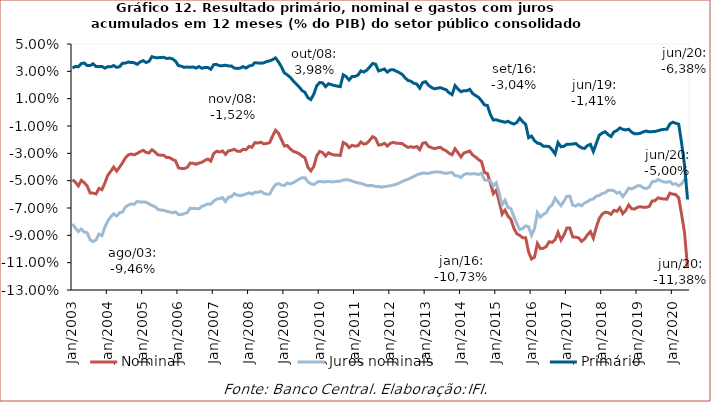
| Category | Nominal | Juros nominais | Primário |
|---|---|---|---|
| 2003-01-01 | -0.049 | -0.082 | 0.032 |
| 2003-02-01 | -0.051 | -0.085 | 0.034 |
| 2003-03-01 | -0.054 | -0.087 | 0.033 |
| 2003-04-01 | -0.05 | -0.085 | 0.036 |
| 2003-05-01 | -0.051 | -0.088 | 0.036 |
| 2003-06-01 | -0.054 | -0.088 | 0.034 |
| 2003-07-01 | -0.059 | -0.093 | 0.034 |
| 2003-08-01 | -0.059 | -0.095 | 0.036 |
| 2003-09-01 | -0.06 | -0.093 | 0.034 |
| 2003-10-01 | -0.056 | -0.089 | 0.033 |
| 2003-11-01 | -0.057 | -0.09 | 0.034 |
| 2003-12-01 | -0.052 | -0.084 | 0.032 |
| 2004-01-01 | -0.046 | -0.079 | 0.033 |
| 2004-02-01 | -0.043 | -0.076 | 0.033 |
| 2004-03-01 | -0.04 | -0.074 | 0.034 |
| 2004-04-01 | -0.043 | -0.076 | 0.033 |
| 2004-05-01 | -0.04 | -0.073 | 0.033 |
| 2004-06-01 | -0.037 | -0.073 | 0.036 |
| 2004-07-01 | -0.033 | -0.069 | 0.036 |
| 2004-08-01 | -0.031 | -0.068 | 0.037 |
| 2004-09-01 | -0.031 | -0.067 | 0.036 |
| 2004-10-01 | -0.031 | -0.067 | 0.036 |
| 2004-11-01 | -0.03 | -0.065 | 0.035 |
| 2004-12-01 | -0.029 | -0.066 | 0.037 |
| 2005-01-01 | -0.028 | -0.066 | 0.038 |
| 2005-02-01 | -0.029 | -0.066 | 0.036 |
| 2005-03-01 | -0.03 | -0.067 | 0.037 |
| 2005-04-01 | -0.027 | -0.068 | 0.041 |
| 2005-05-01 | -0.029 | -0.069 | 0.04 |
| 2005-06-01 | -0.031 | -0.071 | 0.04 |
| 2005-07-01 | -0.031 | -0.072 | 0.04 |
| 2005-08-01 | -0.031 | -0.072 | 0.04 |
| 2005-09-01 | -0.033 | -0.072 | 0.039 |
| 2005-10-01 | -0.033 | -0.073 | 0.04 |
| 2005-11-01 | -0.034 | -0.074 | 0.039 |
| 2005-12-01 | -0.035 | -0.073 | 0.037 |
| 2006-01-01 | -0.041 | -0.075 | 0.034 |
| 2006-02-01 | -0.041 | -0.075 | 0.034 |
| 2006-03-01 | -0.041 | -0.074 | 0.033 |
| 2006-04-01 | -0.04 | -0.073 | 0.033 |
| 2006-05-01 | -0.037 | -0.07 | 0.033 |
| 2006-06-01 | -0.037 | -0.07 | 0.033 |
| 2006-07-01 | -0.038 | -0.07 | 0.032 |
| 2006-08-01 | -0.037 | -0.071 | 0.034 |
| 2006-09-01 | -0.037 | -0.069 | 0.032 |
| 2006-10-01 | -0.035 | -0.068 | 0.033 |
| 2006-11-01 | -0.034 | -0.067 | 0.033 |
| 2006-12-01 | -0.036 | -0.067 | 0.032 |
| 2007-01-01 | -0.03 | -0.065 | 0.035 |
| 2007-02-01 | -0.028 | -0.063 | 0.035 |
| 2007-03-01 | -0.029 | -0.063 | 0.034 |
| 2007-04-01 | -0.028 | -0.062 | 0.034 |
| 2007-05-01 | -0.031 | -0.065 | 0.035 |
| 2007-06-01 | -0.028 | -0.062 | 0.034 |
| 2007-07-01 | -0.028 | -0.062 | 0.034 |
| 2007-08-01 | -0.027 | -0.059 | 0.032 |
| 2007-09-01 | -0.028 | -0.061 | 0.032 |
| 2007-10-01 | -0.029 | -0.061 | 0.032 |
| 2007-11-01 | -0.027 | -0.06 | 0.033 |
| 2007-12-01 | -0.027 | -0.06 | 0.032 |
| 2008-01-01 | -0.025 | -0.059 | 0.034 |
| 2008-02-01 | -0.026 | -0.06 | 0.034 |
| 2008-03-01 | -0.022 | -0.058 | 0.036 |
| 2008-04-01 | -0.022 | -0.059 | 0.036 |
| 2008-05-01 | -0.022 | -0.058 | 0.036 |
| 2008-06-01 | -0.023 | -0.059 | 0.036 |
| 2008-07-01 | -0.023 | -0.06 | 0.037 |
| 2008-08-01 | -0.022 | -0.06 | 0.038 |
| 2008-09-01 | -0.017 | -0.056 | 0.039 |
| 2008-10-01 | -0.013 | -0.053 | 0.04 |
| 2008-11-01 | -0.015 | -0.052 | 0.037 |
| 2008-12-01 | -0.02 | -0.053 | 0.033 |
| 2009-01-01 | -0.025 | -0.054 | 0.029 |
| 2009-02-01 | -0.024 | -0.052 | 0.027 |
| 2009-03-01 | -0.027 | -0.052 | 0.026 |
| 2009-04-01 | -0.029 | -0.052 | 0.023 |
| 2009-05-01 | -0.029 | -0.05 | 0.021 |
| 2009-06-01 | -0.03 | -0.049 | 0.019 |
| 2009-07-01 | -0.032 | -0.048 | 0.016 |
| 2009-08-01 | -0.033 | -0.048 | 0.015 |
| 2009-09-01 | -0.04 | -0.051 | 0.011 |
| 2009-10-01 | -0.043 | -0.052 | 0.009 |
| 2009-11-01 | -0.04 | -0.053 | 0.013 |
| 2009-12-01 | -0.032 | -0.051 | 0.019 |
| 2010-01-01 | -0.029 | -0.05 | 0.022 |
| 2010-02-01 | -0.029 | -0.051 | 0.022 |
| 2010-03-01 | -0.032 | -0.051 | 0.019 |
| 2010-04-01 | -0.03 | -0.051 | 0.021 |
| 2010-05-01 | -0.031 | -0.051 | 0.02 |
| 2010-06-01 | -0.031 | -0.051 | 0.02 |
| 2010-07-01 | -0.031 | -0.05 | 0.019 |
| 2010-08-01 | -0.032 | -0.05 | 0.019 |
| 2010-09-01 | -0.022 | -0.05 | 0.028 |
| 2010-10-01 | -0.023 | -0.049 | 0.026 |
| 2010-11-01 | -0.026 | -0.049 | 0.024 |
| 2010-12-01 | -0.024 | -0.05 | 0.026 |
| 2011-01-01 | -0.025 | -0.051 | 0.026 |
| 2011-02-01 | -0.024 | -0.052 | 0.027 |
| 2011-03-01 | -0.022 | -0.052 | 0.03 |
| 2011-04-01 | -0.023 | -0.053 | 0.029 |
| 2011-05-01 | -0.023 | -0.053 | 0.031 |
| 2011-06-01 | -0.02 | -0.054 | 0.033 |
| 2011-07-01 | -0.018 | -0.054 | 0.036 |
| 2011-08-01 | -0.019 | -0.054 | 0.035 |
| 2011-09-01 | -0.024 | -0.054 | 0.03 |
| 2011-10-01 | -0.024 | -0.055 | 0.031 |
| 2011-11-01 | -0.023 | -0.054 | 0.032 |
| 2011-12-01 | -0.025 | -0.054 | 0.029 |
| 2012-01-01 | -0.023 | -0.054 | 0.031 |
| 2012-02-01 | -0.022 | -0.053 | 0.031 |
| 2012-03-01 | -0.023 | -0.053 | 0.03 |
| 2012-04-01 | -0.023 | -0.052 | 0.029 |
| 2012-05-01 | -0.023 | -0.051 | 0.028 |
| 2012-06-01 | -0.024 | -0.05 | 0.025 |
| 2012-07-01 | -0.026 | -0.049 | 0.023 |
| 2012-08-01 | -0.025 | -0.048 | 0.023 |
| 2012-09-01 | -0.026 | -0.047 | 0.021 |
| 2012-10-01 | -0.025 | -0.046 | 0.021 |
| 2012-11-01 | -0.027 | -0.045 | 0.018 |
| 2012-12-01 | -0.023 | -0.044 | 0.022 |
| 2013-01-01 | -0.022 | -0.045 | 0.022 |
| 2013-02-01 | -0.025 | -0.045 | 0.02 |
| 2013-03-01 | -0.026 | -0.044 | 0.018 |
| 2013-04-01 | -0.027 | -0.044 | 0.017 |
| 2013-05-01 | -0.026 | -0.044 | 0.018 |
| 2013-06-01 | -0.026 | -0.044 | 0.018 |
| 2013-07-01 | -0.027 | -0.044 | 0.017 |
| 2013-08-01 | -0.028 | -0.045 | 0.016 |
| 2013-09-01 | -0.03 | -0.044 | 0.014 |
| 2013-10-01 | -0.031 | -0.044 | 0.013 |
| 2013-11-01 | -0.027 | -0.046 | 0.02 |
| 2013-12-01 | -0.03 | -0.047 | 0.017 |
| 2014-01-01 | -0.033 | -0.048 | 0.015 |
| 2014-02-01 | -0.03 | -0.046 | 0.016 |
| 2014-03-01 | -0.029 | -0.045 | 0.016 |
| 2014-04-01 | -0.028 | -0.045 | 0.017 |
| 2014-05-01 | -0.031 | -0.045 | 0.014 |
| 2014-06-01 | -0.033 | -0.045 | 0.012 |
| 2014-07-01 | -0.035 | -0.046 | 0.011 |
| 2014-08-01 | -0.036 | -0.044 | 0.008 |
| 2014-09-01 | -0.044 | -0.049 | 0.005 |
| 2014-10-01 | -0.045 | -0.05 | 0.005 |
| 2014-11-01 | -0.052 | -0.05 | -0.002 |
| 2014-12-01 | -0.06 | -0.054 | -0.006 |
| 2015-01-01 | -0.057 | -0.052 | -0.005 |
| 2015-02-01 | -0.065 | -0.059 | -0.006 |
| 2015-03-01 | -0.074 | -0.068 | -0.007 |
| 2015-04-01 | -0.072 | -0.064 | -0.007 |
| 2015-05-01 | -0.076 | -0.07 | -0.007 |
| 2015-06-01 | -0.078 | -0.071 | -0.008 |
| 2015-07-01 | -0.085 | -0.076 | -0.009 |
| 2015-08-01 | -0.089 | -0.082 | -0.007 |
| 2015-09-01 | -0.09 | -0.086 | -0.004 |
| 2015-10-01 | -0.092 | -0.085 | -0.007 |
| 2015-11-01 | -0.092 | -0.083 | -0.009 |
| 2015-12-01 | -0.102 | -0.084 | -0.019 |
| 2016-01-01 | -0.107 | -0.09 | -0.017 |
| 2016-02-01 | -0.106 | -0.085 | -0.021 |
| 2016-03-01 | -0.096 | -0.073 | -0.023 |
| 2016-04-01 | -0.1 | -0.077 | -0.023 |
| 2016-05-01 | -0.099 | -0.075 | -0.025 |
| 2016-06-01 | -0.098 | -0.073 | -0.025 |
| 2016-07-01 | -0.095 | -0.07 | -0.025 |
| 2016-08-01 | -0.095 | -0.068 | -0.027 |
| 2016-09-01 | -0.093 | -0.063 | -0.03 |
| 2016-10-01 | -0.088 | -0.066 | -0.022 |
| 2016-11-01 | -0.093 | -0.068 | -0.025 |
| 2016-12-01 | -0.09 | -0.065 | -0.025 |
| 2017-01-01 | -0.085 | -0.061 | -0.023 |
| 2017-02-01 | -0.085 | -0.061 | -0.023 |
| 2017-03-01 | -0.091 | -0.068 | -0.023 |
| 2017-04-01 | -0.091 | -0.069 | -0.023 |
| 2017-05-01 | -0.092 | -0.067 | -0.025 |
| 2017-06-01 | -0.094 | -0.068 | -0.026 |
| 2017-07-01 | -0.093 | -0.066 | -0.026 |
| 2017-08-01 | -0.09 | -0.065 | -0.024 |
| 2017-09-01 | -0.087 | -0.064 | -0.023 |
| 2017-10-01 | -0.092 | -0.063 | -0.029 |
| 2017-11-01 | -0.084 | -0.061 | -0.023 |
| 2017-12-01 | -0.078 | -0.061 | -0.017 |
| 2018-01-01 | -0.075 | -0.059 | -0.015 |
| 2018-02-01 | -0.073 | -0.059 | -0.014 |
| 2018-03-01 | -0.073 | -0.057 | -0.016 |
| 2018-04-01 | -0.075 | -0.057 | -0.018 |
| 2018-05-01 | -0.072 | -0.057 | -0.014 |
| 2018-06-01 | -0.072 | -0.059 | -0.013 |
| 2018-07-01 | -0.07 | -0.058 | -0.011 |
| 2018-08-01 | -0.074 | -0.062 | -0.012 |
| 2018-09-01 | -0.072 | -0.059 | -0.013 |
| 2018-10-01 | -0.068 | -0.055 | -0.012 |
| 2018-11-01 | -0.071 | -0.056 | -0.014 |
| 2018-12-01 | -0.071 | -0.055 | -0.016 |
| 2019-01-01 | -0.069 | -0.054 | -0.016 |
| 2019-02-01 | -0.069 | -0.054 | -0.015 |
| 2019-03-01 | -0.07 | -0.055 | -0.014 |
| 2019-04-01 | -0.069 | -0.056 | -0.014 |
| 2019-05-01 | -0.069 | -0.055 | -0.014 |
| 2019-06-01 | -0.065 | -0.051 | -0.014 |
| 2019-07-01 | -0.065 | -0.051 | -0.014 |
| 2019-08-01 | -0.063 | -0.049 | -0.013 |
| 2019-09-01 | -0.063 | -0.05 | -0.013 |
| 2019-10-01 | -0.063 | -0.051 | -0.012 |
| 2019-11-01 | -0.064 | -0.051 | -0.012 |
| 2019-12-01 | -0.059 | -0.051 | -0.009 |
| 2020-01-01 | -0.06 | -0.053 | -0.007 |
| 2020-02-01 | -0.06 | -0.052 | -0.008 |
| 2020-03-01 | -0.062 | -0.054 | -0.009 |
| 2020-04-01 | -0.075 | -0.052 | -0.023 |
| 2020-05-01 | -0.088 | -0.049 | -0.039 |
| 2020-06-01 | -0.114 | -0.05 | -0.064 |